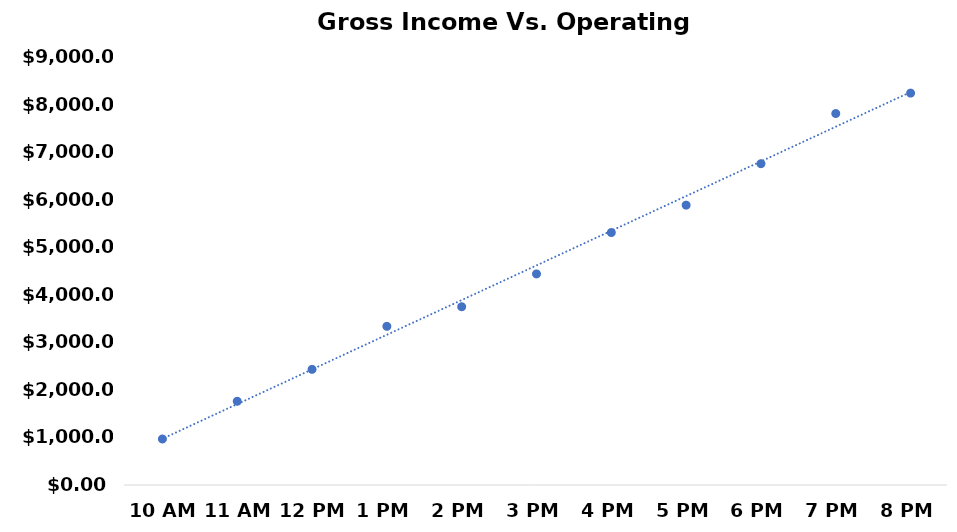
| Category | Series 0 |
|---|---|
| 10 AM | 967.561 |
| 11 AM | 1760.318 |
| 12 PM | 2431.553 |
| 1 PM | 3336.226 |
| 2 PM | 3748.166 |
| 3 PM | 4438.616 |
| 4 PM | 5308.55 |
| 5 PM | 5884.5 |
| 6 PM | 6756.406 |
| 7 PM | 7811.228 |
| 8 PM | 8240.47 |